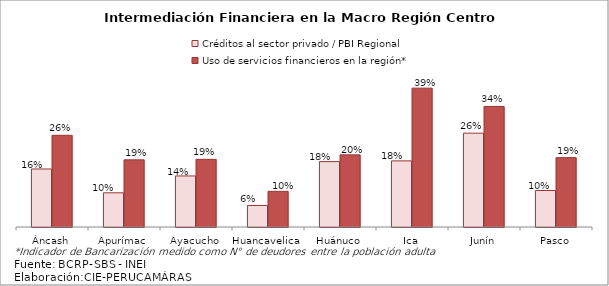
| Category | Créditos al sector privado / PBI Regional | Uso de servicios financieros en la región* |
|---|---|---|
| Áncash | 0.162 | 0.256 |
| Apurímac | 0.095 | 0.187 |
| Ayacucho | 0.142 | 0.189 |
| Huancavelica | 0.06 | 0.099 |
| Huánuco | 0.183 | 0.201 |
| Ica | 0.185 | 0.388 |
| Junín | 0.262 | 0.336 |
| Pasco | 0.102 | 0.194 |